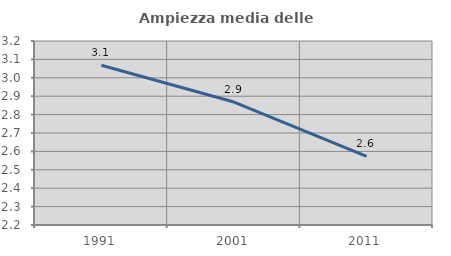
| Category | Ampiezza media delle famiglie |
|---|---|
| 1991.0 | 3.068 |
| 2001.0 | 2.868 |
| 2011.0 | 2.573 |